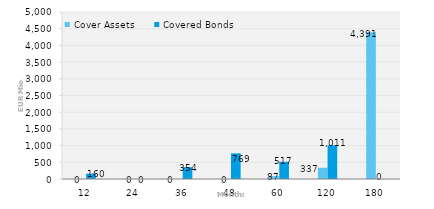
| Category | Cover Assets | Covered Bonds |
|---|---|---|
| 12.0 | 0 | 160 |
| 24.0 | 0 | 0 |
| 36.0 | 0 | 354.35 |
| 48.0 | 0 | 769 |
| 60.0 | 86.663 | 516.597 |
| 120.0 | 337.022 | 1011.45 |
| 180.0 | 4390.915 | 0 |